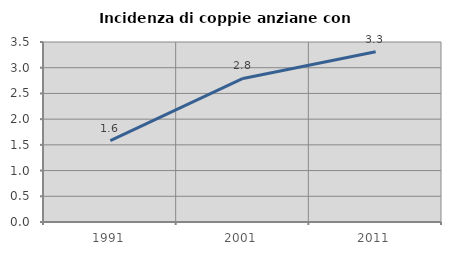
| Category | Incidenza di coppie anziane con figli |
|---|---|
| 1991.0 | 1.583 |
| 2001.0 | 2.791 |
| 2011.0 | 3.312 |